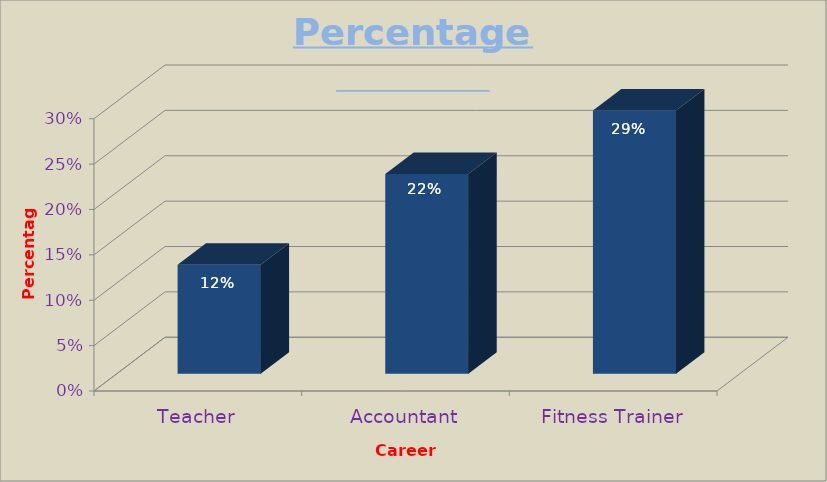
| Category | Percentage Growth |
|---|---|
| Teacher | 0.12 |
| Accountant | 0.22 |
| Fitness Trainer | 0.29 |